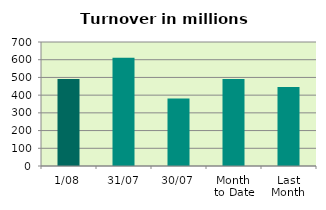
| Category | Series 0 |
|---|---|
| 1/08 | 491.018 |
| 31/07 | 611.286 |
| 30/07 | 381 |
| Month 
to Date | 491.018 |
| Last
Month | 446.279 |